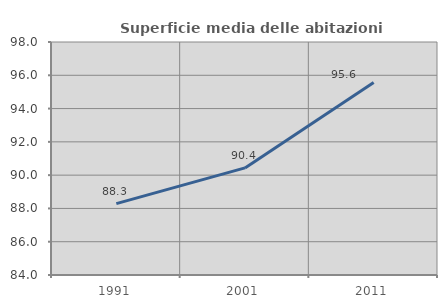
| Category | Superficie media delle abitazioni occupate |
|---|---|
| 1991.0 | 88.287 |
| 2001.0 | 90.437 |
| 2011.0 | 95.569 |